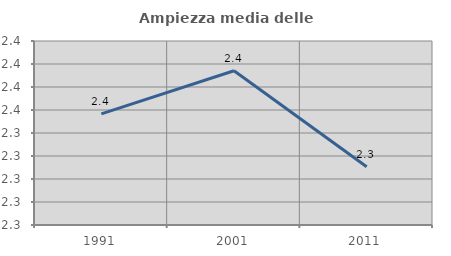
| Category | Ampiezza media delle famiglie |
|---|---|
| 1991.0 | 2.357 |
| 2001.0 | 2.394 |
| 2011.0 | 2.311 |